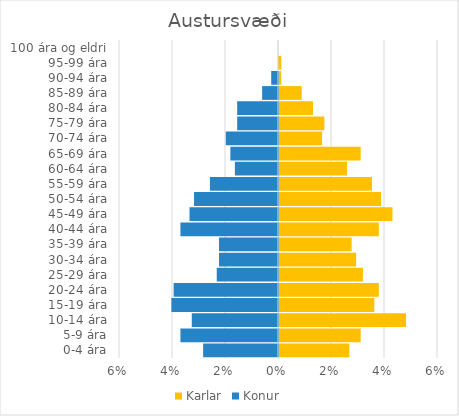
| Category | Karlar | Konur |
|---|---|---|
| 0-4 ára | 0.027 | -0.028 |
| 5-9 ára | 0.031 | -0.037 |
| 10-14 ára | 0.048 | -0.033 |
| 15-19 ára | 0.036 | -0.04 |
| 20-24 ára | 0.038 | -0.039 |
| 25-29 ára | 0.032 | -0.023 |
| 30-34 ára | 0.029 | -0.022 |
| 35-39 ára | 0.027 | -0.022 |
| 40-44 ára | 0.038 | -0.037 |
| 45-49 ára | 0.043 | -0.033 |
| 50-54 ára | 0.039 | -0.032 |
| 55-59 ára | 0.035 | -0.026 |
| 60-64 ára | 0.026 | -0.016 |
| 65-69 ára | 0.031 | -0.018 |
| 70-74 ára | 0.016 | -0.02 |
| 75-79 ára | 0.017 | -0.015 |
| 80-84 ára | 0.013 | -0.015 |
| 85-89 ára | 0.009 | -0.006 |
| 90-94 ára | 0.001 | -0.003 |
| 95-99 ára | 0.001 | 0 |
| 100 ára og eldri | 0 | 0 |